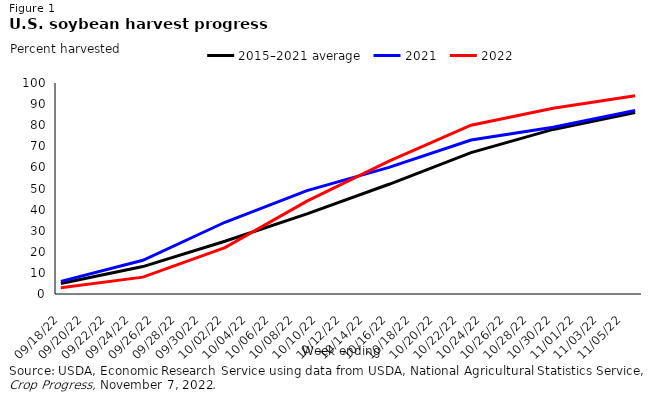
| Category | 2015–2021 average | 2021 | 2022 |
|---|---|---|---|
| 2022-09-18 | 5 | 6 | 3 |
| 2022-09-25 | 13 | 16 | 8 |
| 2022-10-02 | 25 | 34 | 22 |
| 2022-10-09 | 38 | 49 | 44 |
| 2022-10-16 | 52 | 60 | 63 |
| 2022-10-23 | 67 | 73 | 80 |
| 2022-10-30 | 78 | 79 | 88 |
| 2022-11-06 | 86 | 87 | 94 |